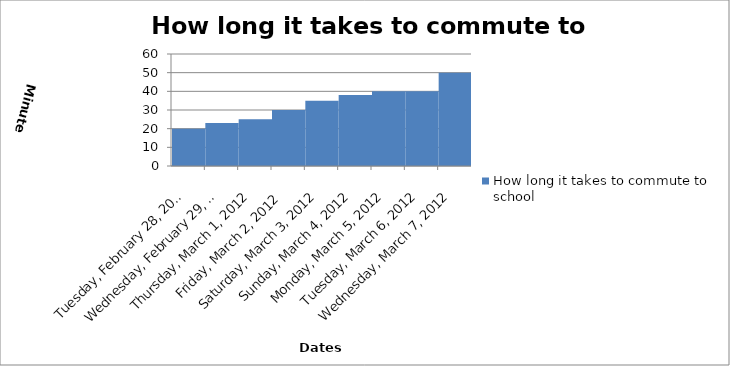
| Category | How long it takes to commute to school |
|---|---|
| 2012-02-28 | 20 |
| 2012-02-29 | 23 |
| 2012-03-01 | 25 |
| 2012-03-02 | 30 |
| 2012-03-03 | 35 |
| 2012-03-04 | 38 |
| 2012-03-05 | 40 |
| 2012-03-06 | 40 |
| 2012-03-07 | 50 |